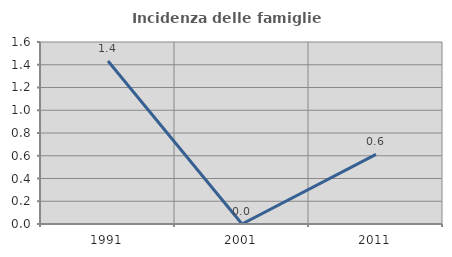
| Category | Incidenza delle famiglie numerose |
|---|---|
| 1991.0 | 1.433 |
| 2001.0 | 0 |
| 2011.0 | 0.612 |